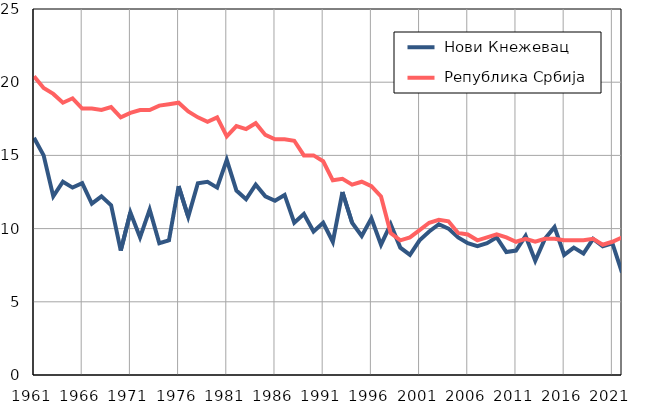
| Category |  Нови Кнежевац |  Република Србија |
|---|---|---|
| 1961.0 | 16.2 | 20.4 |
| 1962.0 | 15 | 19.6 |
| 1963.0 | 12.2 | 19.2 |
| 1964.0 | 13.2 | 18.6 |
| 1965.0 | 12.8 | 18.9 |
| 1966.0 | 13.1 | 18.2 |
| 1967.0 | 11.7 | 18.2 |
| 1968.0 | 12.2 | 18.1 |
| 1969.0 | 11.6 | 18.3 |
| 1970.0 | 8.5 | 17.6 |
| 1971.0 | 11.1 | 17.9 |
| 1972.0 | 9.4 | 18.1 |
| 1973.0 | 11.3 | 18.1 |
| 1974.0 | 9 | 18.4 |
| 1975.0 | 9.2 | 18.5 |
| 1976.0 | 12.9 | 18.6 |
| 1977.0 | 10.8 | 18 |
| 1978.0 | 13.1 | 17.6 |
| 1979.0 | 13.2 | 17.3 |
| 1980.0 | 12.8 | 17.6 |
| 1981.0 | 14.7 | 16.3 |
| 1982.0 | 12.6 | 17 |
| 1983.0 | 12 | 16.8 |
| 1984.0 | 13 | 17.2 |
| 1985.0 | 12.2 | 16.4 |
| 1986.0 | 11.9 | 16.1 |
| 1987.0 | 12.3 | 16.1 |
| 1988.0 | 10.4 | 16 |
| 1989.0 | 11 | 15 |
| 1990.0 | 9.8 | 15 |
| 1991.0 | 10.4 | 14.6 |
| 1992.0 | 9.1 | 13.3 |
| 1993.0 | 12.5 | 13.4 |
| 1994.0 | 10.4 | 13 |
| 1995.0 | 9.5 | 13.2 |
| 1996.0 | 10.7 | 12.9 |
| 1997.0 | 8.9 | 12.2 |
| 1998.0 | 10.3 | 9.7 |
| 1999.0 | 8.7 | 9.2 |
| 2000.0 | 8.2 | 9.4 |
| 2001.0 | 9.2 | 9.9 |
| 2002.0 | 9.8 | 10.4 |
| 2003.0 | 10.3 | 10.6 |
| 2004.0 | 10 | 10.5 |
| 2005.0 | 9.4 | 9.7 |
| 2006.0 | 9 | 9.6 |
| 2007.0 | 8.8 | 9.2 |
| 2008.0 | 9 | 9.4 |
| 2009.0 | 9.4 | 9.6 |
| 2010.0 | 8.4 | 9.4 |
| 2011.0 | 8.5 | 9.1 |
| 2012.0 | 9.5 | 9.3 |
| 2013.0 | 7.8 | 9.1 |
| 2014.0 | 9.3 | 9.3 |
| 2015.0 | 10.1 | 9.3 |
| 2016.0 | 8.2 | 9.2 |
| 2017.0 | 8.7 | 9.2 |
| 2018.0 | 8.3 | 9.2 |
| 2019.0 | 9.3 | 9.3 |
| 2020.0 | 8.8 | 8.9 |
| 2021.0 | 9 | 9.1 |
| 2022.0 | 7 | 9.4 |